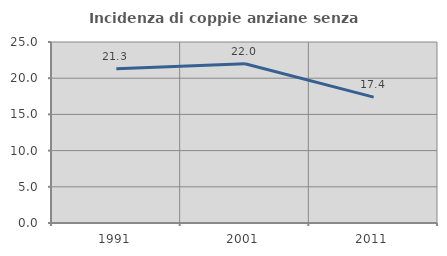
| Category | Incidenza di coppie anziane senza figli  |
|---|---|
| 1991.0 | 21.311 |
| 2001.0 | 22 |
| 2011.0 | 17.391 |